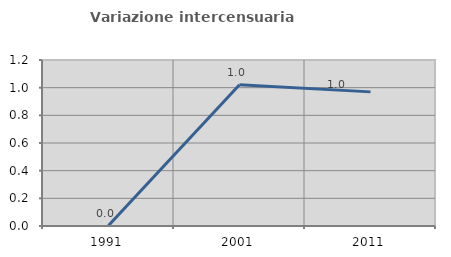
| Category | Variazione intercensuaria annua |
|---|---|
| 1991.0 | 0.003 |
| 2001.0 | 1.022 |
| 2011.0 | 0.97 |